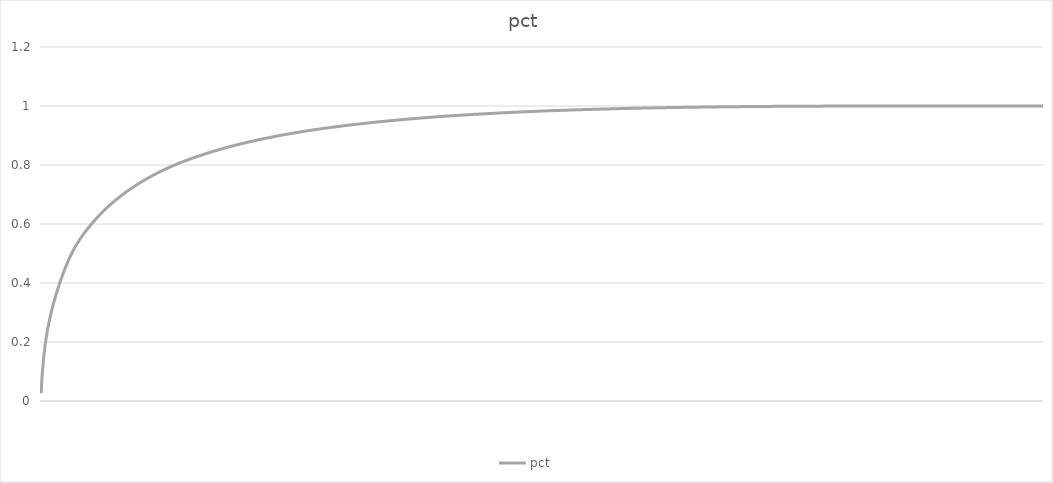
| Category | pct |
|---|---|
|   | 0.026 |
|   | 0.042 |
|   | 0.057 |
|   | 0.071 |
|   | 0.083 |
|   | 0.094 |
|   | 0.103 |
|   | 0.113 |
|   | 0.122 |
|   | 0.13 |
|   | 0.139 |
|   | 0.147 |
|   | 0.155 |
|   | 0.163 |
|   | 0.171 |
|   | 0.178 |
|   | 0.184 |
|   | 0.19 |
|   | 0.196 |
|   | 0.202 |
|   | 0.207 |
|   | 0.212 |
|   | 0.217 |
|   | 0.223 |
|   | 0.228 |
|   | 0.232 |
|   | 0.237 |
|   | 0.241 |
|   | 0.246 |
|   | 0.25 |
|   | 0.254 |
|   | 0.258 |
|   | 0.262 |
|   | 0.266 |
|   | 0.27 |
|   | 0.274 |
|   | 0.277 |
|   | 0.281 |
|   | 0.285 |
|   | 0.288 |
|   | 0.292 |
|   | 0.296 |
|   | 0.299 |
|   | 0.302 |
|   | 0.306 |
|   | 0.309 |
|   | 0.312 |
|   | 0.315 |
|   | 0.318 |
|   | 0.322 |
|   | 0.325 |
|   | 0.327 |
|   | 0.33 |
|   | 0.333 |
|   | 0.336 |
|   | 0.339 |
|   | 0.342 |
|   | 0.345 |
|   | 0.348 |
|   | 0.35 |
|   | 0.353 |
|   | 0.356 |
|   | 0.358 |
|   | 0.361 |
|   | 0.364 |
|   | 0.367 |
|   | 0.369 |
|   | 0.372 |
|   | 0.374 |
|   | 0.377 |
|   | 0.38 |
|   | 0.382 |
|   | 0.385 |
|   | 0.387 |
|   | 0.39 |
|   | 0.392 |
|   | 0.394 |
|   | 0.397 |
|   | 0.399 |
|   | 0.402 |
|   | 0.404 |
|   | 0.406 |
|   | 0.409 |
|   | 0.411 |
|   | 0.413 |
|   | 0.416 |
|   | 0.418 |
|   | 0.42 |
|   | 0.422 |
|   | 0.424 |
|   | 0.427 |
|   | 0.429 |
|   | 0.431 |
|   | 0.433 |
|   | 0.435 |
|   | 0.437 |
|   | 0.439 |
|   | 0.442 |
|   | 0.444 |
|   | 0.446 |
|   | 0.448 |
|   | 0.45 |
|   | 0.452 |
|   | 0.454 |
|   | 0.456 |
|   | 0.458 |
|   | 0.46 |
|   | 0.462 |
|   | 0.464 |
|   | 0.466 |
|   | 0.468 |
|   | 0.47 |
|   | 0.471 |
|   | 0.473 |
|   | 0.475 |
|   | 0.477 |
|   | 0.479 |
|   | 0.481 |
|   | 0.482 |
|   | 0.484 |
|   | 0.486 |
|   | 0.487 |
|   | 0.489 |
|   | 0.491 |
|   | 0.493 |
|   | 0.494 |
|   | 0.496 |
|   | 0.498 |
|   | 0.499 |
|   | 0.501 |
|   | 0.502 |
|   | 0.504 |
|   | 0.506 |
|   | 0.507 |
|   | 0.509 |
|   | 0.51 |
|   | 0.512 |
|   | 0.513 |
|   | 0.515 |
|   | 0.516 |
|   | 0.518 |
|   | 0.519 |
|   | 0.521 |
|   | 0.522 |
|   | 0.523 |
|   | 0.525 |
|   | 0.526 |
|   | 0.527 |
|   | 0.529 |
|   | 0.53 |
|   | 0.531 |
|   | 0.533 |
|   | 0.534 |
|   | 0.535 |
|   | 0.537 |
|   | 0.538 |
|   | 0.539 |
|   | 0.54 |
|   | 0.542 |
|   | 0.543 |
|   | 0.544 |
|   | 0.545 |
|   | 0.547 |
|   | 0.548 |
|   | 0.549 |
|   | 0.55 |
|   | 0.551 |
|   | 0.553 |
|   | 0.554 |
|   | 0.555 |
|   | 0.556 |
|   | 0.557 |
|   | 0.559 |
|   | 0.56 |
|   | 0.561 |
|   | 0.562 |
|   | 0.563 |
|   | 0.564 |
|   | 0.565 |
|   | 0.566 |
|   | 0.567 |
|   | 0.569 |
|   | 0.57 |
|   | 0.571 |
|   | 0.572 |
|   | 0.573 |
|   | 0.574 |
|   | 0.575 |
|   | 0.576 |
|   | 0.577 |
|   | 0.578 |
|   | 0.579 |
|   | 0.58 |
|   | 0.581 |
|   | 0.582 |
|   | 0.583 |
|   | 0.584 |
|   | 0.585 |
|   | 0.586 |
|   | 0.587 |
|   | 0.588 |
|   | 0.589 |
|   | 0.59 |
|   | 0.591 |
|   | 0.592 |
|   | 0.593 |
|   | 0.594 |
|   | 0.595 |
|   | 0.596 |
|   | 0.597 |
|   | 0.598 |
|   | 0.599 |
|   | 0.6 |
|   | 0.601 |
|   | 0.602 |
|   | 0.603 |
|   | 0.604 |
|   | 0.605 |
|   | 0.606 |
|   | 0.607 |
|   | 0.607 |
|   | 0.608 |
|   | 0.609 |
|   | 0.61 |
|   | 0.611 |
|   | 0.612 |
|   | 0.613 |
|   | 0.614 |
|   | 0.615 |
|   | 0.616 |
|   | 0.617 |
|   | 0.617 |
|   | 0.618 |
|   | 0.619 |
|   | 0.62 |
|   | 0.621 |
|   | 0.622 |
|   | 0.623 |
|   | 0.624 |
|   | 0.624 |
|   | 0.625 |
|   | 0.626 |
|   | 0.627 |
|   | 0.628 |
|   | 0.629 |
|   | 0.63 |
|   | 0.63 |
|   | 0.631 |
|   | 0.632 |
|   | 0.633 |
|   | 0.634 |
|   | 0.635 |
|   | 0.636 |
|   | 0.636 |
|   | 0.637 |
|   | 0.638 |
|   | 0.639 |
|   | 0.64 |
|   | 0.64 |
|   | 0.641 |
|   | 0.642 |
|   | 0.643 |
|   | 0.644 |
|   | 0.645 |
|   | 0.645 |
|   | 0.646 |
|   | 0.647 |
|   | 0.648 |
|   | 0.649 |
|   | 0.649 |
|   | 0.65 |
|   | 0.651 |
|   | 0.652 |
|   | 0.652 |
|   | 0.653 |
|   | 0.654 |
|   | 0.655 |
|   | 0.656 |
|   | 0.656 |
|   | 0.657 |
|   | 0.658 |
|   | 0.659 |
|   | 0.659 |
|   | 0.66 |
|   | 0.661 |
|   | 0.662 |
|   | 0.662 |
|   | 0.663 |
|   | 0.664 |
|   | 0.664 |
|   | 0.665 |
|   | 0.666 |
|   | 0.667 |
|   | 0.667 |
|   | 0.668 |
|   | 0.669 |
|   | 0.669 |
|   | 0.67 |
|   | 0.671 |
|   | 0.671 |
|   | 0.672 |
|   | 0.673 |
|   | 0.673 |
|   | 0.674 |
|   | 0.675 |
|   | 0.676 |
|   | 0.676 |
|   | 0.677 |
|   | 0.678 |
|   | 0.678 |
|   | 0.679 |
|   | 0.68 |
|   | 0.68 |
|   | 0.681 |
|   | 0.682 |
|   | 0.682 |
|   | 0.683 |
|   | 0.684 |
|   | 0.684 |
|   | 0.685 |
|   | 0.686 |
|   | 0.686 |
|   | 0.687 |
|   | 0.688 |
|   | 0.688 |
|   | 0.689 |
|   | 0.689 |
|   | 0.69 |
|   | 0.691 |
|   | 0.691 |
|   | 0.692 |
|   | 0.693 |
|   | 0.693 |
|   | 0.694 |
|   | 0.694 |
|   | 0.695 |
|   | 0.696 |
|   | 0.696 |
|   | 0.697 |
|   | 0.698 |
|   | 0.698 |
|   | 0.699 |
|   | 0.699 |
|   | 0.7 |
|   | 0.701 |
|   | 0.701 |
|   | 0.702 |
|   | 0.702 |
|   | 0.703 |
|   | 0.704 |
|   | 0.704 |
|   | 0.705 |
|   | 0.705 |
|   | 0.706 |
|   | 0.707 |
|   | 0.707 |
|   | 0.708 |
|   | 0.708 |
|   | 0.709 |
|   | 0.709 |
|   | 0.71 |
|   | 0.711 |
|   | 0.711 |
|   | 0.712 |
|   | 0.712 |
|   | 0.713 |
|   | 0.713 |
|   | 0.714 |
|   | 0.715 |
|   | 0.715 |
|   | 0.716 |
|   | 0.716 |
|   | 0.717 |
|   | 0.717 |
|   | 0.718 |
|   | 0.718 |
|   | 0.719 |
|   | 0.719 |
|   | 0.72 |
|   | 0.721 |
|   | 0.721 |
|   | 0.722 |
|   | 0.722 |
|   | 0.723 |
|   | 0.723 |
|   | 0.724 |
|   | 0.724 |
|   | 0.725 |
|   | 0.725 |
|   | 0.726 |
|   | 0.727 |
|   | 0.727 |
|   | 0.728 |
|   | 0.728 |
|   | 0.729 |
|   | 0.729 |
|   | 0.73 |
|   | 0.73 |
|   | 0.731 |
|   | 0.731 |
|   | 0.732 |
|   | 0.732 |
|   | 0.733 |
|   | 0.733 |
|   | 0.734 |
|   | 0.734 |
|   | 0.735 |
|   | 0.735 |
|   | 0.736 |
|   | 0.736 |
|   | 0.737 |
|   | 0.737 |
|   | 0.738 |
|   | 0.738 |
|   | 0.739 |
|   | 0.739 |
|   | 0.74 |
|   | 0.74 |
|   | 0.741 |
|   | 0.741 |
|   | 0.742 |
|   | 0.742 |
|   | 0.743 |
|   | 0.743 |
|   | 0.744 |
|   | 0.744 |
|   | 0.745 |
|   | 0.745 |
|   | 0.746 |
|   | 0.746 |
|   | 0.747 |
|   | 0.747 |
|   | 0.748 |
|   | 0.748 |
|   | 0.749 |
|   | 0.749 |
|   | 0.75 |
|   | 0.75 |
|   | 0.751 |
|   | 0.751 |
|   | 0.751 |
|   | 0.752 |
|   | 0.752 |
|   | 0.753 |
|   | 0.753 |
|   | 0.754 |
|   | 0.754 |
|   | 0.755 |
|   | 0.755 |
|   | 0.756 |
|   | 0.756 |
|   | 0.756 |
|   | 0.757 |
|   | 0.757 |
|   | 0.758 |
|   | 0.758 |
|   | 0.759 |
|   | 0.759 |
|   | 0.76 |
|   | 0.76 |
|   | 0.76 |
|   | 0.761 |
|   | 0.761 |
|   | 0.762 |
|   | 0.762 |
|   | 0.763 |
|   | 0.763 |
|   | 0.764 |
|   | 0.764 |
|   | 0.764 |
|   | 0.765 |
|   | 0.765 |
|   | 0.766 |
|   | 0.766 |
|   | 0.767 |
|   | 0.767 |
|   | 0.767 |
|   | 0.768 |
|   | 0.768 |
|   | 0.769 |
|   | 0.769 |
|   | 0.77 |
|   | 0.77 |
|   | 0.77 |
|   | 0.771 |
|   | 0.771 |
|   | 0.772 |
|   | 0.772 |
|   | 0.772 |
|   | 0.773 |
|   | 0.773 |
|   | 0.774 |
|   | 0.774 |
|   | 0.775 |
|   | 0.775 |
|   | 0.775 |
|   | 0.776 |
|   | 0.776 |
|   | 0.777 |
|   | 0.777 |
|   | 0.777 |
|   | 0.778 |
|   | 0.778 |
|   | 0.779 |
|   | 0.779 |
|   | 0.779 |
|   | 0.78 |
|   | 0.78 |
|   | 0.78 |
|   | 0.781 |
|   | 0.781 |
|   | 0.782 |
|   | 0.782 |
|   | 0.782 |
|   | 0.783 |
|   | 0.783 |
|   | 0.784 |
|   | 0.784 |
|   | 0.784 |
|   | 0.785 |
|   | 0.785 |
|   | 0.785 |
|   | 0.786 |
|   | 0.786 |
|   | 0.787 |
|   | 0.787 |
|   | 0.787 |
|   | 0.788 |
|   | 0.788 |
|   | 0.788 |
|   | 0.789 |
|   | 0.789 |
|   | 0.79 |
|   | 0.79 |
|   | 0.79 |
|   | 0.791 |
|   | 0.791 |
|   | 0.791 |
|   | 0.792 |
|   | 0.792 |
|   | 0.792 |
|   | 0.793 |
|   | 0.793 |
|   | 0.793 |
|   | 0.794 |
|   | 0.794 |
|   | 0.795 |
|   | 0.795 |
|   | 0.795 |
|   | 0.796 |
|   | 0.796 |
|   | 0.796 |
|   | 0.797 |
|   | 0.797 |
|   | 0.797 |
|   | 0.798 |
|   | 0.798 |
|   | 0.798 |
|   | 0.799 |
|   | 0.799 |
|   | 0.799 |
|   | 0.8 |
|   | 0.8 |
|   | 0.8 |
|   | 0.801 |
|   | 0.801 |
|   | 0.802 |
|   | 0.802 |
|   | 0.802 |
|   | 0.803 |
|   | 0.803 |
|   | 0.803 |
|   | 0.804 |
|   | 0.804 |
|   | 0.804 |
|   | 0.805 |
|   | 0.805 |
|   | 0.805 |
|   | 0.806 |
|   | 0.806 |
|   | 0.806 |
|   | 0.806 |
|   | 0.807 |
|   | 0.807 |
|   | 0.807 |
|   | 0.808 |
|   | 0.808 |
|   | 0.808 |
|   | 0.809 |
|   | 0.809 |
|   | 0.809 |
|   | 0.81 |
|   | 0.81 |
|   | 0.81 |
|   | 0.811 |
|   | 0.811 |
|   | 0.811 |
|   | 0.812 |
|   | 0.812 |
|   | 0.812 |
|   | 0.812 |
|   | 0.813 |
|   | 0.813 |
|   | 0.813 |
|   | 0.814 |
|   | 0.814 |
|   | 0.814 |
|   | 0.815 |
|   | 0.815 |
|   | 0.815 |
|   | 0.816 |
|   | 0.816 |
|   | 0.816 |
|   | 0.816 |
|   | 0.817 |
|   | 0.817 |
|   | 0.817 |
|   | 0.818 |
|   | 0.818 |
|   | 0.818 |
|   | 0.819 |
|   | 0.819 |
|   | 0.819 |
|   | 0.819 |
|   | 0.82 |
|   | 0.82 |
|   | 0.82 |
|   | 0.821 |
|   | 0.821 |
|   | 0.821 |
|   | 0.821 |
|   | 0.822 |
|   | 0.822 |
|   | 0.822 |
|   | 0.823 |
|   | 0.823 |
|   | 0.823 |
|   | 0.823 |
|   | 0.824 |
|   | 0.824 |
|   | 0.824 |
|   | 0.825 |
|   | 0.825 |
|   | 0.825 |
|   | 0.825 |
|   | 0.826 |
|   | 0.826 |
|   | 0.826 |
|   | 0.826 |
|   | 0.827 |
|   | 0.827 |
|   | 0.827 |
|   | 0.828 |
|   | 0.828 |
|   | 0.828 |
|   | 0.828 |
|   | 0.829 |
|   | 0.829 |
|   | 0.829 |
|   | 0.829 |
|   | 0.83 |
|   | 0.83 |
|   | 0.83 |
|   | 0.831 |
|   | 0.831 |
|   | 0.831 |
|   | 0.831 |
|   | 0.832 |
|   | 0.832 |
|   | 0.832 |
|   | 0.832 |
|   | 0.833 |
|   | 0.833 |
|   | 0.833 |
|   | 0.834 |
|   | 0.834 |
|   | 0.834 |
|   | 0.834 |
|   | 0.835 |
|   | 0.835 |
|   | 0.835 |
|   | 0.835 |
|   | 0.836 |
|   | 0.836 |
|   | 0.836 |
|   | 0.836 |
|   | 0.837 |
|   | 0.837 |
|   | 0.837 |
|   | 0.837 |
|   | 0.838 |
|   | 0.838 |
|   | 0.838 |
|   | 0.839 |
|   | 0.839 |
|   | 0.839 |
|   | 0.839 |
|   | 0.84 |
|   | 0.84 |
|   | 0.84 |
|   | 0.84 |
|   | 0.841 |
|   | 0.841 |
|   | 0.841 |
|   | 0.841 |
|   | 0.842 |
|   | 0.842 |
|   | 0.842 |
|   | 0.842 |
|   | 0.843 |
|   | 0.843 |
|   | 0.843 |
|   | 0.843 |
|   | 0.844 |
|   | 0.844 |
|   | 0.844 |
|   | 0.844 |
|   | 0.845 |
|   | 0.845 |
|   | 0.845 |
|   | 0.845 |
|   | 0.846 |
|   | 0.846 |
|   | 0.846 |
|   | 0.846 |
|   | 0.847 |
|   | 0.847 |
|   | 0.847 |
|   | 0.847 |
|   | 0.848 |
|   | 0.848 |
|   | 0.848 |
|   | 0.848 |
|   | 0.849 |
|   | 0.849 |
|   | 0.849 |
|   | 0.849 |
|   | 0.85 |
|   | 0.85 |
|   | 0.85 |
|   | 0.85 |
|   | 0.851 |
|   | 0.851 |
|   | 0.851 |
|   | 0.851 |
|   | 0.851 |
|   | 0.852 |
|   | 0.852 |
|   | 0.852 |
|   | 0.852 |
|   | 0.853 |
|   | 0.853 |
|   | 0.853 |
|   | 0.853 |
|   | 0.854 |
|   | 0.854 |
|   | 0.854 |
|   | 0.854 |
|   | 0.855 |
|   | 0.855 |
|   | 0.855 |
|   | 0.855 |
|   | 0.855 |
|   | 0.856 |
|   | 0.856 |
|   | 0.856 |
|   | 0.856 |
|   | 0.857 |
|   | 0.857 |
|   | 0.857 |
|   | 0.857 |
|   | 0.857 |
|   | 0.858 |
|   | 0.858 |
|   | 0.858 |
|   | 0.858 |
|   | 0.858 |
|   | 0.859 |
|   | 0.859 |
|   | 0.859 |
|   | 0.859 |
|   | 0.86 |
|   | 0.86 |
|   | 0.86 |
|   | 0.86 |
|   | 0.86 |
|   | 0.861 |
|   | 0.861 |
|   | 0.861 |
|   | 0.861 |
|   | 0.861 |
|   | 0.862 |
|   | 0.862 |
|   | 0.862 |
|   | 0.862 |
|   | 0.863 |
|   | 0.863 |
|   | 0.863 |
|   | 0.863 |
|   | 0.863 |
|   | 0.864 |
|   | 0.864 |
|   | 0.864 |
|   | 0.864 |
|   | 0.864 |
|   | 0.865 |
|   | 0.865 |
|   | 0.865 |
|   | 0.865 |
|   | 0.865 |
|   | 0.866 |
|   | 0.866 |
|   | 0.866 |
|   | 0.866 |
|   | 0.867 |
|   | 0.867 |
|   | 0.867 |
|   | 0.867 |
|   | 0.867 |
|   | 0.868 |
|   | 0.868 |
|   | 0.868 |
|   | 0.868 |
|   | 0.868 |
|   | 0.869 |
|   | 0.869 |
|   | 0.869 |
|   | 0.869 |
|   | 0.869 |
|   | 0.87 |
|   | 0.87 |
|   | 0.87 |
|   | 0.87 |
|   | 0.87 |
|   | 0.87 |
|   | 0.871 |
|   | 0.871 |
|   | 0.871 |
|   | 0.871 |
|   | 0.871 |
|   | 0.872 |
|   | 0.872 |
|   | 0.872 |
|   | 0.872 |
|   | 0.872 |
|   | 0.873 |
|   | 0.873 |
|   | 0.873 |
|   | 0.873 |
|   | 0.873 |
|   | 0.874 |
|   | 0.874 |
|   | 0.874 |
|   | 0.874 |
|   | 0.874 |
|   | 0.875 |
|   | 0.875 |
|   | 0.875 |
|   | 0.875 |
|   | 0.875 |
|   | 0.875 |
|   | 0.876 |
|   | 0.876 |
|   | 0.876 |
|   | 0.876 |
|   | 0.876 |
|   | 0.877 |
|   | 0.877 |
|   | 0.877 |
|   | 0.877 |
|   | 0.877 |
|   | 0.878 |
|   | 0.878 |
|   | 0.878 |
|   | 0.878 |
|   | 0.878 |
|   | 0.878 |
|   | 0.879 |
|   | 0.879 |
|   | 0.879 |
|   | 0.879 |
|   | 0.879 |
|   | 0.88 |
|   | 0.88 |
|   | 0.88 |
|   | 0.88 |
|   | 0.88 |
|   | 0.881 |
|   | 0.881 |
|   | 0.881 |
|   | 0.881 |
|   | 0.881 |
|   | 0.881 |
|   | 0.882 |
|   | 0.882 |
|   | 0.882 |
|   | 0.882 |
|   | 0.882 |
|   | 0.883 |
|   | 0.883 |
|   | 0.883 |
|   | 0.883 |
|   | 0.883 |
|   | 0.883 |
|   | 0.884 |
|   | 0.884 |
|   | 0.884 |
|   | 0.884 |
|   | 0.884 |
|   | 0.884 |
|   | 0.885 |
|   | 0.885 |
|   | 0.885 |
|   | 0.885 |
|   | 0.885 |
|   | 0.886 |
|   | 0.886 |
|   | 0.886 |
|   | 0.886 |
|   | 0.886 |
|   | 0.886 |
|   | 0.887 |
|   | 0.887 |
|   | 0.887 |
|   | 0.887 |
|   | 0.887 |
|   | 0.887 |
|   | 0.888 |
|   | 0.888 |
|   | 0.888 |
|   | 0.888 |
|   | 0.888 |
|   | 0.888 |
|   | 0.889 |
|   | 0.889 |
|   | 0.889 |
|   | 0.889 |
|   | 0.889 |
|   | 0.889 |
|   | 0.89 |
|   | 0.89 |
|   | 0.89 |
|   | 0.89 |
|   | 0.89 |
|   | 0.89 |
|   | 0.891 |
|   | 0.891 |
|   | 0.891 |
|   | 0.891 |
|   | 0.891 |
|   | 0.891 |
|   | 0.892 |
|   | 0.892 |
|   | 0.892 |
|   | 0.892 |
|   | 0.892 |
|   | 0.892 |
|   | 0.893 |
|   | 0.893 |
|   | 0.893 |
|   | 0.893 |
|   | 0.893 |
|   | 0.893 |
|   | 0.894 |
|   | 0.894 |
|   | 0.894 |
|   | 0.894 |
|   | 0.894 |
|   | 0.894 |
|   | 0.895 |
|   | 0.895 |
|   | 0.895 |
|   | 0.895 |
|   | 0.895 |
|   | 0.895 |
|   | 0.895 |
|   | 0.896 |
|   | 0.896 |
|   | 0.896 |
|   | 0.896 |
|   | 0.896 |
|   | 0.896 |
|   | 0.897 |
|   | 0.897 |
|   | 0.897 |
|   | 0.897 |
|   | 0.897 |
|   | 0.897 |
|   | 0.898 |
|   | 0.898 |
|   | 0.898 |
|   | 0.898 |
|   | 0.898 |
|   | 0.898 |
|   | 0.898 |
|   | 0.899 |
|   | 0.899 |
|   | 0.899 |
|   | 0.899 |
| 1000 | 0.899 |
|   | 0.899 |
|   | 0.9 |
|   | 0.9 |
|   | 0.9 |
|   | 0.9 |
|   | 0.9 |
|   | 0.9 |
|   | 0.9 |
|   | 0.901 |
|   | 0.901 |
|   | 0.901 |
|   | 0.901 |
|   | 0.901 |
|   | 0.901 |
|   | 0.901 |
|   | 0.902 |
|   | 0.902 |
|   | 0.902 |
|   | 0.902 |
|   | 0.902 |
|   | 0.902 |
|   | 0.903 |
|   | 0.903 |
|   | 0.903 |
|   | 0.903 |
|   | 0.903 |
|   | 0.903 |
|   | 0.903 |
|   | 0.904 |
|   | 0.904 |
|   | 0.904 |
|   | 0.904 |
|   | 0.904 |
|   | 0.904 |
|   | 0.904 |
|   | 0.905 |
|   | 0.905 |
|   | 0.905 |
|   | 0.905 |
|   | 0.905 |
|   | 0.905 |
|   | 0.905 |
|   | 0.906 |
|   | 0.906 |
|   | 0.906 |
|   | 0.906 |
|   | 0.906 |
|   | 0.906 |
|   | 0.906 |
|   | 0.907 |
|   | 0.907 |
|   | 0.907 |
|   | 0.907 |
|   | 0.907 |
|   | 0.907 |
|   | 0.907 |
|   | 0.908 |
|   | 0.908 |
|   | 0.908 |
|   | 0.908 |
|   | 0.908 |
|   | 0.908 |
|   | 0.908 |
|   | 0.909 |
|   | 0.909 |
|   | 0.909 |
|   | 0.909 |
|   | 0.909 |
|   | 0.909 |
|   | 0.909 |
|   | 0.909 |
|   | 0.91 |
|   | 0.91 |
|   | 0.91 |
|   | 0.91 |
|   | 0.91 |
|   | 0.91 |
|   | 0.91 |
|   | 0.911 |
|   | 0.911 |
|   | 0.911 |
|   | 0.911 |
|   | 0.911 |
|   | 0.911 |
|   | 0.911 |
|   | 0.911 |
|   | 0.912 |
|   | 0.912 |
|   | 0.912 |
|   | 0.912 |
|   | 0.912 |
|   | 0.912 |
|   | 0.912 |
|   | 0.913 |
|   | 0.913 |
|   | 0.913 |
|   | 0.913 |
|   | 0.913 |
|   | 0.913 |
|   | 0.913 |
|   | 0.913 |
|   | 0.914 |
|   | 0.914 |
|   | 0.914 |
|   | 0.914 |
|   | 0.914 |
|   | 0.914 |
|   | 0.914 |
|   | 0.914 |
|   | 0.915 |
|   | 0.915 |
|   | 0.915 |
|   | 0.915 |
|   | 0.915 |
|   | 0.915 |
|   | 0.915 |
|   | 0.915 |
|   | 0.916 |
|   | 0.916 |
|   | 0.916 |
|   | 0.916 |
|   | 0.916 |
|   | 0.916 |
|   | 0.916 |
|   | 0.916 |
|   | 0.917 |
|   | 0.917 |
|   | 0.917 |
|   | 0.917 |
|   | 0.917 |
|   | 0.917 |
|   | 0.917 |
|   | 0.917 |
|   | 0.918 |
|   | 0.918 |
|   | 0.918 |
|   | 0.918 |
|   | 0.918 |
|   | 0.918 |
|   | 0.918 |
|   | 0.918 |
|   | 0.919 |
|   | 0.919 |
|   | 0.919 |
|   | 0.919 |
|   | 0.919 |
|   | 0.919 |
|   | 0.919 |
|   | 0.919 |
|   | 0.92 |
|   | 0.92 |
|   | 0.92 |
|   | 0.92 |
|   | 0.92 |
|   | 0.92 |
|   | 0.92 |
|   | 0.92 |
|   | 0.92 |
|   | 0.921 |
|   | 0.921 |
|   | 0.921 |
|   | 0.921 |
|   | 0.921 |
|   | 0.921 |
|   | 0.921 |
|   | 0.921 |
|   | 0.921 |
|   | 0.922 |
|   | 0.922 |
|   | 0.922 |
|   | 0.922 |
|   | 0.922 |
|   | 0.922 |
|   | 0.922 |
|   | 0.922 |
|   | 0.923 |
|   | 0.923 |
|   | 0.923 |
|   | 0.923 |
|   | 0.923 |
|   | 0.923 |
|   | 0.923 |
|   | 0.923 |
|   | 0.923 |
|   | 0.924 |
|   | 0.924 |
|   | 0.924 |
|   | 0.924 |
|   | 0.924 |
|   | 0.924 |
|   | 0.924 |
|   | 0.924 |
|   | 0.924 |
|   | 0.925 |
|   | 0.925 |
|   | 0.925 |
|   | 0.925 |
|   | 0.925 |
|   | 0.925 |
|   | 0.925 |
|   | 0.925 |
|   | 0.925 |
|   | 0.926 |
|   | 0.926 |
|   | 0.926 |
|   | 0.926 |
|   | 0.926 |
|   | 0.926 |
|   | 0.926 |
|   | 0.926 |
|   | 0.926 |
|   | 0.927 |
|   | 0.927 |
|   | 0.927 |
|   | 0.927 |
|   | 0.927 |
|   | 0.927 |
|   | 0.927 |
|   | 0.927 |
|   | 0.927 |
|   | 0.928 |
|   | 0.928 |
|   | 0.928 |
|   | 0.928 |
|   | 0.928 |
|   | 0.928 |
|   | 0.928 |
|   | 0.928 |
|   | 0.928 |
|   | 0.928 |
|   | 0.929 |
|   | 0.929 |
|   | 0.929 |
|   | 0.929 |
|   | 0.929 |
|   | 0.929 |
|   | 0.929 |
|   | 0.929 |
|   | 0.929 |
|   | 0.93 |
|   | 0.93 |
|   | 0.93 |
|   | 0.93 |
|   | 0.93 |
|   | 0.93 |
|   | 0.93 |
|   | 0.93 |
|   | 0.93 |
|   | 0.93 |
|   | 0.931 |
|   | 0.931 |
|   | 0.931 |
|   | 0.931 |
|   | 0.931 |
|   | 0.931 |
|   | 0.931 |
|   | 0.931 |
|   | 0.931 |
|   | 0.931 |
|   | 0.932 |
|   | 0.932 |
|   | 0.932 |
|   | 0.932 |
|   | 0.932 |
|   | 0.932 |
|   | 0.932 |
|   | 0.932 |
|   | 0.932 |
|   | 0.933 |
|   | 0.933 |
|   | 0.933 |
|   | 0.933 |
|   | 0.933 |
|   | 0.933 |
|   | 0.933 |
|   | 0.933 |
|   | 0.933 |
|   | 0.933 |
|   | 0.934 |
|   | 0.934 |
|   | 0.934 |
|   | 0.934 |
|   | 0.934 |
|   | 0.934 |
|   | 0.934 |
|   | 0.934 |
|   | 0.934 |
|   | 0.934 |
|   | 0.935 |
|   | 0.935 |
|   | 0.935 |
|   | 0.935 |
|   | 0.935 |
|   | 0.935 |
|   | 0.935 |
|   | 0.935 |
|   | 0.935 |
|   | 0.935 |
|   | 0.936 |
|   | 0.936 |
|   | 0.936 |
|   | 0.936 |
|   | 0.936 |
|   | 0.936 |
|   | 0.936 |
|   | 0.936 |
|   | 0.936 |
|   | 0.936 |
|   | 0.936 |
|   | 0.937 |
|   | 0.937 |
|   | 0.937 |
|   | 0.937 |
|   | 0.937 |
|   | 0.937 |
|   | 0.937 |
|   | 0.937 |
|   | 0.937 |
|   | 0.937 |
|   | 0.937 |
|   | 0.938 |
|   | 0.938 |
|   | 0.938 |
|   | 0.938 |
|   | 0.938 |
|   | 0.938 |
|   | 0.938 |
|   | 0.938 |
|   | 0.938 |
|   | 0.938 |
|   | 0.939 |
|   | 0.939 |
|   | 0.939 |
|   | 0.939 |
|   | 0.939 |
|   | 0.939 |
|   | 0.939 |
|   | 0.939 |
|   | 0.939 |
|   | 0.939 |
|   | 0.939 |
|   | 0.94 |
|   | 0.94 |
|   | 0.94 |
|   | 0.94 |
|   | 0.94 |
|   | 0.94 |
|   | 0.94 |
|   | 0.94 |
|   | 0.94 |
|   | 0.94 |
|   | 0.94 |
|   | 0.941 |
|   | 0.941 |
|   | 0.941 |
|   | 0.941 |
|   | 0.941 |
|   | 0.941 |
|   | 0.941 |
|   | 0.941 |
|   | 0.941 |
|   | 0.941 |
|   | 0.941 |
|   | 0.941 |
|   | 0.942 |
|   | 0.942 |
|   | 0.942 |
|   | 0.942 |
|   | 0.942 |
|   | 0.942 |
|   | 0.942 |
|   | 0.942 |
|   | 0.942 |
|   | 0.942 |
|   | 0.942 |
|   | 0.943 |
|   | 0.943 |
|   | 0.943 |
|   | 0.943 |
|   | 0.943 |
|   | 0.943 |
|   | 0.943 |
|   | 0.943 |
|   | 0.943 |
|   | 0.943 |
|   | 0.943 |
|   | 0.943 |
|   | 0.944 |
|   | 0.944 |
|   | 0.944 |
|   | 0.944 |
|   | 0.944 |
|   | 0.944 |
|   | 0.944 |
|   | 0.944 |
|   | 0.944 |
|   | 0.944 |
|   | 0.944 |
|   | 0.945 |
|   | 0.945 |
|   | 0.945 |
|   | 0.945 |
|   | 0.945 |
|   | 0.945 |
|   | 0.945 |
|   | 0.945 |
|   | 0.945 |
|   | 0.945 |
|   | 0.945 |
|   | 0.945 |
|   | 0.946 |
|   | 0.946 |
|   | 0.946 |
|   | 0.946 |
|   | 0.946 |
|   | 0.946 |
|   | 0.946 |
|   | 0.946 |
|   | 0.946 |
|   | 0.946 |
|   | 0.946 |
|   | 0.946 |
|   | 0.946 |
|   | 0.947 |
|   | 0.947 |
|   | 0.947 |
|   | 0.947 |
|   | 0.947 |
|   | 0.947 |
|   | 0.947 |
|   | 0.947 |
|   | 0.947 |
|   | 0.947 |
|   | 0.947 |
|   | 0.947 |
|   | 0.948 |
|   | 0.948 |
|   | 0.948 |
|   | 0.948 |
|   | 0.948 |
|   | 0.948 |
|   | 0.948 |
|   | 0.948 |
|   | 0.948 |
|   | 0.948 |
|   | 0.948 |
|   | 0.948 |
|   | 0.948 |
|   | 0.949 |
|   | 0.949 |
|   | 0.949 |
|   | 0.949 |
|   | 0.949 |
|   | 0.949 |
|   | 0.949 |
|   | 0.949 |
|   | 0.949 |
|   | 0.949 |
|   | 0.949 |
|   | 0.949 |
|   | 0.95 |
|   | 0.95 |
|   | 0.95 |
|   | 0.95 |
|   | 0.95 |
|   | 0.95 |
|   | 0.95 |
|   | 0.95 |
|   | 0.95 |
|   | 0.95 |
|   | 0.95 |
|   | 0.95 |
|   | 0.95 |
|   | 0.95 |
|   | 0.951 |
|   | 0.951 |
|   | 0.951 |
|   | 0.951 |
|   | 0.951 |
|   | 0.951 |
|   | 0.951 |
|   | 0.951 |
|   | 0.951 |
|   | 0.951 |
|   | 0.951 |
|   | 0.951 |
|   | 0.951 |
|   | 0.952 |
|   | 0.952 |
|   | 0.952 |
|   | 0.952 |
|   | 0.952 |
|   | 0.952 |
|   | 0.952 |
|   | 0.952 |
|   | 0.952 |
|   | 0.952 |
|   | 0.952 |
|   | 0.952 |
|   | 0.952 |
|   | 0.952 |
|   | 0.953 |
|   | 0.953 |
|   | 0.953 |
|   | 0.953 |
|   | 0.953 |
|   | 0.953 |
|   | 0.953 |
|   | 0.953 |
|   | 0.953 |
|   | 0.953 |
|   | 0.953 |
|   | 0.953 |
|   | 0.953 |
|   | 0.954 |
|   | 0.954 |
|   | 0.954 |
|   | 0.954 |
|   | 0.954 |
|   | 0.954 |
|   | 0.954 |
|   | 0.954 |
|   | 0.954 |
|   | 0.954 |
|   | 0.954 |
|   | 0.954 |
|   | 0.954 |
|   | 0.954 |
|   | 0.955 |
|   | 0.955 |
|   | 0.955 |
|   | 0.955 |
|   | 0.955 |
|   | 0.955 |
|   | 0.955 |
|   | 0.955 |
|   | 0.955 |
|   | 0.955 |
|   | 0.955 |
|   | 0.955 |
|   | 0.955 |
|   | 0.955 |
|   | 0.955 |
|   | 0.956 |
|   | 0.956 |
|   | 0.956 |
|   | 0.956 |
|   | 0.956 |
|   | 0.956 |
|   | 0.956 |
|   | 0.956 |
|   | 0.956 |
|   | 0.956 |
|   | 0.956 |
|   | 0.956 |
|   | 0.956 |
|   | 0.956 |
|   | 0.957 |
|   | 0.957 |
|   | 0.957 |
|   | 0.957 |
|   | 0.957 |
|   | 0.957 |
|   | 0.957 |
|   | 0.957 |
|   | 0.957 |
|   | 0.957 |
|   | 0.957 |
|   | 0.957 |
|   | 0.957 |
|   | 0.957 |
|   | 0.957 |
|   | 0.958 |
|   | 0.958 |
|   | 0.958 |
|   | 0.958 |
|   | 0.958 |
|   | 0.958 |
|   | 0.958 |
|   | 0.958 |
|   | 0.958 |
|   | 0.958 |
|   | 0.958 |
|   | 0.958 |
|   | 0.958 |
|   | 0.958 |
|   | 0.958 |
|   | 0.959 |
|   | 0.959 |
|   | 0.959 |
|   | 0.959 |
|   | 0.959 |
|   | 0.959 |
|   | 0.959 |
|   | 0.959 |
|   | 0.959 |
|   | 0.959 |
|   | 0.959 |
|   | 0.959 |
|   | 0.959 |
|   | 0.959 |
|   | 0.959 |
|   | 0.96 |
|   | 0.96 |
|   | 0.96 |
|   | 0.96 |
|   | 0.96 |
|   | 0.96 |
|   | 0.96 |
|   | 0.96 |
|   | 0.96 |
|   | 0.96 |
|   | 0.96 |
|   | 0.96 |
|   | 0.96 |
|   | 0.96 |
|   | 0.96 |
|   | 0.961 |
|   | 0.961 |
|   | 0.961 |
|   | 0.961 |
|   | 0.961 |
|   | 0.961 |
|   | 0.961 |
|   | 0.961 |
|   | 0.961 |
|   | 0.961 |
|   | 0.961 |
|   | 0.961 |
|   | 0.961 |
|   | 0.961 |
|   | 0.961 |
|   | 0.961 |
|   | 0.962 |
|   | 0.962 |
|   | 0.962 |
|   | 0.962 |
|   | 0.962 |
|   | 0.962 |
|   | 0.962 |
|   | 0.962 |
|   | 0.962 |
|   | 0.962 |
|   | 0.962 |
|   | 0.962 |
|   | 0.962 |
|   | 0.962 |
|   | 0.962 |
|   | 0.962 |
|   | 0.963 |
|   | 0.963 |
|   | 0.963 |
|   | 0.963 |
|   | 0.963 |
|   | 0.963 |
|   | 0.963 |
|   | 0.963 |
|   | 0.963 |
|   | 0.963 |
|   | 0.963 |
|   | 0.963 |
|   | 0.963 |
|   | 0.963 |
|   | 0.963 |
|   | 0.963 |
|   | 0.963 |
|   | 0.964 |
|   | 0.964 |
|   | 0.964 |
|   | 0.964 |
|   | 0.964 |
|   | 0.964 |
|   | 0.964 |
|   | 0.964 |
|   | 0.964 |
|   | 0.964 |
|   | 0.964 |
|   | 0.964 |
|   | 0.964 |
|   | 0.964 |
|   | 0.964 |
|   | 0.964 |
|   | 0.964 |
|   | 0.965 |
|   | 0.965 |
|   | 0.965 |
|   | 0.965 |
|   | 0.965 |
|   | 0.965 |
|   | 0.965 |
|   | 0.965 |
|   | 0.965 |
|   | 0.965 |
|   | 0.965 |
|   | 0.965 |
|   | 0.965 |
|   | 0.965 |
|   | 0.965 |
|   | 0.965 |
|   | 0.965 |
|   | 0.965 |
|   | 0.966 |
|   | 0.966 |
|   | 0.966 |
|   | 0.966 |
|   | 0.966 |
|   | 0.966 |
|   | 0.966 |
|   | 0.966 |
|   | 0.966 |
|   | 0.966 |
|   | 0.966 |
|   | 0.966 |
|   | 0.966 |
|   | 0.966 |
|   | 0.966 |
|   | 0.966 |
|   | 0.966 |
|   | 0.966 |
|   | 0.967 |
|   | 0.967 |
|   | 0.967 |
|   | 0.967 |
|   | 0.967 |
|   | 0.967 |
|   | 0.967 |
|   | 0.967 |
|   | 0.967 |
|   | 0.967 |
|   | 0.967 |
|   | 0.967 |
|   | 0.967 |
|   | 0.967 |
|   | 0.967 |
|   | 0.967 |
|   | 0.967 |
|   | 0.967 |
|   | 0.967 |
|   | 0.968 |
|   | 0.968 |
|   | 0.968 |
|   | 0.968 |
|   | 0.968 |
|   | 0.968 |
|   | 0.968 |
|   | 0.968 |
|   | 0.968 |
|   | 0.968 |
|   | 0.968 |
|   | 0.968 |
|   | 0.968 |
|   | 0.968 |
|   | 0.968 |
|   | 0.968 |
|   | 0.968 |
|   | 0.968 |
|   | 0.968 |
|   | 0.968 |
|   | 0.969 |
|   | 0.969 |
|   | 0.969 |
|   | 0.969 |
|   | 0.969 |
|   | 0.969 |
|   | 0.969 |
|   | 0.969 |
|   | 0.969 |
|   | 0.969 |
|   | 0.969 |
|   | 0.969 |
|   | 0.969 |
|   | 0.969 |
|   | 0.969 |
|   | 0.969 |
|   | 0.969 |
|   | 0.969 |
|   | 0.969 |
|   | 0.97 |
|   | 0.97 |
|   | 0.97 |
|   | 0.97 |
|   | 0.97 |
|   | 0.97 |
|   | 0.97 |
|   | 0.97 |
|   | 0.97 |
|   | 0.97 |
|   | 0.97 |
|   | 0.97 |
|   | 0.97 |
|   | 0.97 |
|   | 0.97 |
|   | 0.97 |
|   | 0.97 |
|   | 0.97 |
|   | 0.97 |
|   | 0.97 |
|   | 0.971 |
|   | 0.971 |
|   | 0.971 |
|   | 0.971 |
|   | 0.971 |
|   | 0.971 |
|   | 0.971 |
|   | 0.971 |
|   | 0.971 |
|   | 0.971 |
|   | 0.971 |
|   | 0.971 |
|   | 0.971 |
|   | 0.971 |
|   | 0.971 |
|   | 0.971 |
|   | 0.971 |
|   | 0.971 |
|   | 0.971 |
|   | 0.971 |
|   | 0.971 |
|   | 0.972 |
|   | 0.972 |
|   | 0.972 |
|   | 0.972 |
|   | 0.972 |
|   | 0.972 |
|   | 0.972 |
|   | 0.972 |
|   | 0.972 |
|   | 0.972 |
|   | 0.972 |
|   | 0.972 |
|   | 0.972 |
|   | 0.972 |
|   | 0.972 |
|   | 0.972 |
|   | 0.972 |
|   | 0.972 |
|   | 0.972 |
|   | 0.972 |
|   | 0.972 |
|   | 0.972 |
|   | 0.973 |
|   | 0.973 |
|   | 0.973 |
|   | 0.973 |
|   | 0.973 |
|   | 0.973 |
|   | 0.973 |
|   | 0.973 |
|   | 0.973 |
|   | 0.973 |
|   | 0.973 |
|   | 0.973 |
|   | 0.973 |
|   | 0.973 |
|   | 0.973 |
|   | 0.973 |
|   | 0.973 |
|   | 0.973 |
|   | 0.973 |
|   | 0.973 |
|   | 0.973 |
|   | 0.973 |
|   | 0.974 |
|   | 0.974 |
|   | 0.974 |
|   | 0.974 |
|   | 0.974 |
|   | 0.974 |
|   | 0.974 |
|   | 0.974 |
|   | 0.974 |
|   | 0.974 |
|   | 0.974 |
|   | 0.974 |
|   | 0.974 |
|   | 0.974 |
|   | 0.974 |
|   | 0.974 |
|   | 0.974 |
|   | 0.974 |
|   | 0.974 |
|   | 0.974 |
|   | 0.974 |
|   | 0.974 |
|   | 0.974 |
|   | 0.975 |
|   | 0.975 |
|   | 0.975 |
|   | 0.975 |
|   | 0.975 |
|   | 0.975 |
|   | 0.975 |
|   | 0.975 |
|   | 0.975 |
|   | 0.975 |
|   | 0.975 |
|   | 0.975 |
|   | 0.975 |
|   | 0.975 |
|   | 0.975 |
|   | 0.975 |
|   | 0.975 |
|   | 0.975 |
|   | 0.975 |
|   | 0.975 |
|   | 0.975 |
|   | 0.975 |
|   | 0.975 |
|   | 0.976 |
|   | 0.976 |
|   | 0.976 |
|   | 0.976 |
|   | 0.976 |
|   | 0.976 |
|   | 0.976 |
|   | 0.976 |
|   | 0.976 |
|   | 0.976 |
|   | 0.976 |
|   | 0.976 |
|   | 0.976 |
|   | 0.976 |
|   | 0.976 |
|   | 0.976 |
|   | 0.976 |
|   | 0.976 |
|   | 0.976 |
|   | 0.976 |
|   | 0.976 |
|   | 0.976 |
|   | 0.976 |
|   | 0.976 |
|   | 0.976 |
|   | 0.977 |
|   | 0.977 |
|   | 0.977 |
|   | 0.977 |
|   | 0.977 |
|   | 0.977 |
|   | 0.977 |
|   | 0.977 |
|   | 0.977 |
|   | 0.977 |
|   | 0.977 |
|   | 0.977 |
|   | 0.977 |
|   | 0.977 |
|   | 0.977 |
|   | 0.977 |
|   | 0.977 |
|   | 0.977 |
|   | 0.977 |
|   | 0.977 |
|   | 0.977 |
|   | 0.977 |
|   | 0.977 |
|   | 0.977 |
|   | 0.978 |
|   | 0.978 |
|   | 0.978 |
|   | 0.978 |
|   | 0.978 |
|   | 0.978 |
|   | 0.978 |
|   | 0.978 |
|   | 0.978 |
|   | 0.978 |
|   | 0.978 |
|   | 0.978 |
|   | 0.978 |
|   | 0.978 |
|   | 0.978 |
|   | 0.978 |
|   | 0.978 |
|   | 0.978 |
|   | 0.978 |
|   | 0.978 |
|   | 0.978 |
|   | 0.978 |
|   | 0.978 |
|   | 0.978 |
|   | 0.978 |
|   | 0.978 |
|   | 0.979 |
|   | 0.979 |
|   | 0.979 |
|   | 0.979 |
|   | 0.979 |
|   | 0.979 |
|   | 0.979 |
|   | 0.979 |
|   | 0.979 |
|   | 0.979 |
|   | 0.979 |
|   | 0.979 |
|   | 0.979 |
|   | 0.979 |
|   | 0.979 |
|   | 0.979 |
| 2000 | 0.979 |
|   | 0.979 |
|   | 0.979 |
|   | 0.979 |
|   | 0.979 |
|   | 0.979 |
|   | 0.979 |
|   | 0.979 |
|   | 0.979 |
|   | 0.979 |
|   | 0.979 |
|   | 0.98 |
|   | 0.98 |
|   | 0.98 |
|   | 0.98 |
|   | 0.98 |
|   | 0.98 |
|   | 0.98 |
|   | 0.98 |
|   | 0.98 |
|   | 0.98 |
|   | 0.98 |
|   | 0.98 |
|   | 0.98 |
|   | 0.98 |
|   | 0.98 |
|   | 0.98 |
|   | 0.98 |
|   | 0.98 |
|   | 0.98 |
|   | 0.98 |
|   | 0.98 |
|   | 0.98 |
|   | 0.98 |
|   | 0.98 |
|   | 0.98 |
|   | 0.98 |
|   | 0.98 |
|   | 0.981 |
|   | 0.981 |
|   | 0.981 |
|   | 0.981 |
|   | 0.981 |
|   | 0.981 |
|   | 0.981 |
|   | 0.981 |
|   | 0.981 |
|   | 0.981 |
|   | 0.981 |
|   | 0.981 |
|   | 0.981 |
|   | 0.981 |
|   | 0.981 |
|   | 0.981 |
|   | 0.981 |
|   | 0.981 |
|   | 0.981 |
|   | 0.981 |
|   | 0.981 |
|   | 0.981 |
|   | 0.981 |
|   | 0.981 |
|   | 0.981 |
|   | 0.981 |
|   | 0.981 |
|   | 0.981 |
|   | 0.981 |
|   | 0.982 |
|   | 0.982 |
|   | 0.982 |
|   | 0.982 |
|   | 0.982 |
|   | 0.982 |
|   | 0.982 |
|   | 0.982 |
|   | 0.982 |
|   | 0.982 |
|   | 0.982 |
|   | 0.982 |
|   | 0.982 |
|   | 0.982 |
|   | 0.982 |
|   | 0.982 |
|   | 0.982 |
|   | 0.982 |
|   | 0.982 |
|   | 0.982 |
|   | 0.982 |
|   | 0.982 |
|   | 0.982 |
|   | 0.982 |
|   | 0.982 |
|   | 0.982 |
|   | 0.982 |
|   | 0.982 |
|   | 0.982 |
|   | 0.982 |
|   | 0.983 |
|   | 0.983 |
|   | 0.983 |
|   | 0.983 |
|   | 0.983 |
|   | 0.983 |
|   | 0.983 |
|   | 0.983 |
|   | 0.983 |
|   | 0.983 |
|   | 0.983 |
|   | 0.983 |
|   | 0.983 |
|   | 0.983 |
|   | 0.983 |
|   | 0.983 |
|   | 0.983 |
|   | 0.983 |
|   | 0.983 |
|   | 0.983 |
|   | 0.983 |
|   | 0.983 |
|   | 0.983 |
|   | 0.983 |
|   | 0.983 |
|   | 0.983 |
|   | 0.983 |
|   | 0.983 |
|   | 0.983 |
|   | 0.983 |
|   | 0.983 |
|   | 0.984 |
|   | 0.984 |
|   | 0.984 |
|   | 0.984 |
|   | 0.984 |
|   | 0.984 |
|   | 0.984 |
|   | 0.984 |
|   | 0.984 |
|   | 0.984 |
|   | 0.984 |
|   | 0.984 |
|   | 0.984 |
|   | 0.984 |
|   | 0.984 |
|   | 0.984 |
|   | 0.984 |
|   | 0.984 |
|   | 0.984 |
|   | 0.984 |
|   | 0.984 |
|   | 0.984 |
|   | 0.984 |
|   | 0.984 |
|   | 0.984 |
|   | 0.984 |
|   | 0.984 |
|   | 0.984 |
|   | 0.984 |
|   | 0.984 |
|   | 0.984 |
|   | 0.984 |
|   | 0.984 |
|   | 0.985 |
|   | 0.985 |
|   | 0.985 |
|   | 0.985 |
|   | 0.985 |
|   | 0.985 |
|   | 0.985 |
|   | 0.985 |
|   | 0.985 |
|   | 0.985 |
|   | 0.985 |
|   | 0.985 |
|   | 0.985 |
|   | 0.985 |
|   | 0.985 |
|   | 0.985 |
|   | 0.985 |
|   | 0.985 |
|   | 0.985 |
|   | 0.985 |
|   | 0.985 |
|   | 0.985 |
|   | 0.985 |
|   | 0.985 |
|   | 0.985 |
|   | 0.985 |
|   | 0.985 |
|   | 0.985 |
|   | 0.985 |
|   | 0.985 |
|   | 0.985 |
|   | 0.985 |
|   | 0.985 |
|   | 0.985 |
|   | 0.985 |
|   | 0.986 |
|   | 0.986 |
|   | 0.986 |
|   | 0.986 |
|   | 0.986 |
|   | 0.986 |
|   | 0.986 |
|   | 0.986 |
|   | 0.986 |
|   | 0.986 |
|   | 0.986 |
|   | 0.986 |
|   | 0.986 |
|   | 0.986 |
|   | 0.986 |
|   | 0.986 |
|   | 0.986 |
|   | 0.986 |
|   | 0.986 |
|   | 0.986 |
|   | 0.986 |
|   | 0.986 |
|   | 0.986 |
|   | 0.986 |
|   | 0.986 |
|   | 0.986 |
|   | 0.986 |
|   | 0.986 |
|   | 0.986 |
|   | 0.986 |
|   | 0.986 |
|   | 0.986 |
|   | 0.986 |
|   | 0.986 |
|   | 0.986 |
|   | 0.986 |
|   | 0.986 |
|   | 0.987 |
|   | 0.987 |
|   | 0.987 |
|   | 0.987 |
|   | 0.987 |
|   | 0.987 |
|   | 0.987 |
|   | 0.987 |
|   | 0.987 |
|   | 0.987 |
|   | 0.987 |
|   | 0.987 |
|   | 0.987 |
|   | 0.987 |
|   | 0.987 |
|   | 0.987 |
|   | 0.987 |
|   | 0.987 |
|   | 0.987 |
|   | 0.987 |
|   | 0.987 |
|   | 0.987 |
|   | 0.987 |
|   | 0.987 |
|   | 0.987 |
|   | 0.987 |
|   | 0.987 |
|   | 0.987 |
|   | 0.987 |
|   | 0.987 |
|   | 0.987 |
|   | 0.987 |
|   | 0.987 |
|   | 0.987 |
|   | 0.987 |
|   | 0.987 |
|   | 0.987 |
|   | 0.987 |
|   | 0.987 |
|   | 0.988 |
|   | 0.988 |
|   | 0.988 |
|   | 0.988 |
|   | 0.988 |
|   | 0.988 |
|   | 0.988 |
|   | 0.988 |
|   | 0.988 |
|   | 0.988 |
|   | 0.988 |
|   | 0.988 |
|   | 0.988 |
|   | 0.988 |
|   | 0.988 |
|   | 0.988 |
|   | 0.988 |
|   | 0.988 |
|   | 0.988 |
|   | 0.988 |
|   | 0.988 |
|   | 0.988 |
|   | 0.988 |
|   | 0.988 |
|   | 0.988 |
|   | 0.988 |
|   | 0.988 |
|   | 0.988 |
|   | 0.988 |
|   | 0.988 |
|   | 0.988 |
|   | 0.988 |
|   | 0.988 |
|   | 0.988 |
|   | 0.988 |
|   | 0.988 |
|   | 0.988 |
|   | 0.988 |
|   | 0.988 |
|   | 0.988 |
|   | 0.988 |
|   | 0.989 |
|   | 0.989 |
|   | 0.989 |
|   | 0.989 |
|   | 0.989 |
|   | 0.989 |
|   | 0.989 |
|   | 0.989 |
|   | 0.989 |
|   | 0.989 |
|   | 0.989 |
|   | 0.989 |
|   | 0.989 |
|   | 0.989 |
|   | 0.989 |
|   | 0.989 |
|   | 0.989 |
|   | 0.989 |
|   | 0.989 |
|   | 0.989 |
|   | 0.989 |
|   | 0.989 |
|   | 0.989 |
|   | 0.989 |
|   | 0.989 |
|   | 0.989 |
|   | 0.989 |
|   | 0.989 |
|   | 0.989 |
|   | 0.989 |
|   | 0.989 |
|   | 0.989 |
|   | 0.989 |
|   | 0.989 |
|   | 0.989 |
|   | 0.989 |
|   | 0.989 |
|   | 0.989 |
|   | 0.989 |
|   | 0.989 |
|   | 0.989 |
|   | 0.989 |
|   | 0.989 |
|   | 0.989 |
|   | 0.99 |
|   | 0.99 |
|   | 0.99 |
|   | 0.99 |
|   | 0.99 |
|   | 0.99 |
|   | 0.99 |
|   | 0.99 |
|   | 0.99 |
|   | 0.99 |
|   | 0.99 |
|   | 0.99 |
|   | 0.99 |
|   | 0.99 |
|   | 0.99 |
|   | 0.99 |
|   | 0.99 |
|   | 0.99 |
|   | 0.99 |
|   | 0.99 |
|   | 0.99 |
|   | 0.99 |
|   | 0.99 |
|   | 0.99 |
|   | 0.99 |
|   | 0.99 |
|   | 0.99 |
|   | 0.99 |
|   | 0.99 |
|   | 0.99 |
|   | 0.99 |
|   | 0.99 |
|   | 0.99 |
|   | 0.99 |
|   | 0.99 |
|   | 0.99 |
|   | 0.99 |
|   | 0.99 |
|   | 0.99 |
|   | 0.99 |
|   | 0.99 |
|   | 0.99 |
|   | 0.99 |
|   | 0.99 |
|   | 0.99 |
|   | 0.99 |
|   | 0.99 |
|   | 0.991 |
|   | 0.991 |
|   | 0.991 |
|   | 0.991 |
|   | 0.991 |
|   | 0.991 |
|   | 0.991 |
|   | 0.991 |
|   | 0.991 |
|   | 0.991 |
|   | 0.991 |
|   | 0.991 |
|   | 0.991 |
|   | 0.991 |
|   | 0.991 |
|   | 0.991 |
|   | 0.991 |
|   | 0.991 |
|   | 0.991 |
|   | 0.991 |
|   | 0.991 |
|   | 0.991 |
|   | 0.991 |
|   | 0.991 |
|   | 0.991 |
|   | 0.991 |
|   | 0.991 |
|   | 0.991 |
|   | 0.991 |
|   | 0.991 |
|   | 0.991 |
|   | 0.991 |
|   | 0.991 |
|   | 0.991 |
|   | 0.991 |
|   | 0.991 |
|   | 0.991 |
|   | 0.991 |
|   | 0.991 |
|   | 0.991 |
|   | 0.991 |
|   | 0.991 |
|   | 0.991 |
|   | 0.991 |
|   | 0.991 |
|   | 0.991 |
|   | 0.991 |
|   | 0.991 |
|   | 0.991 |
|   | 0.992 |
|   | 0.992 |
|   | 0.992 |
|   | 0.992 |
|   | 0.992 |
|   | 0.992 |
|   | 0.992 |
|   | 0.992 |
|   | 0.992 |
|   | 0.992 |
|   | 0.992 |
|   | 0.992 |
|   | 0.992 |
|   | 0.992 |
|   | 0.992 |
|   | 0.992 |
|   | 0.992 |
|   | 0.992 |
|   | 0.992 |
|   | 0.992 |
|   | 0.992 |
|   | 0.992 |
|   | 0.992 |
|   | 0.992 |
|   | 0.992 |
|   | 0.992 |
|   | 0.992 |
|   | 0.992 |
|   | 0.992 |
|   | 0.992 |
|   | 0.992 |
|   | 0.992 |
|   | 0.992 |
|   | 0.992 |
|   | 0.992 |
|   | 0.992 |
|   | 0.992 |
|   | 0.992 |
|   | 0.992 |
|   | 0.992 |
|   | 0.992 |
|   | 0.992 |
|   | 0.992 |
|   | 0.992 |
|   | 0.992 |
|   | 0.992 |
|   | 0.992 |
|   | 0.992 |
|   | 0.992 |
|   | 0.992 |
|   | 0.992 |
|   | 0.992 |
|   | 0.992 |
|   | 0.992 |
|   | 0.993 |
|   | 0.993 |
|   | 0.993 |
|   | 0.993 |
|   | 0.993 |
|   | 0.993 |
|   | 0.993 |
|   | 0.993 |
|   | 0.993 |
|   | 0.993 |
|   | 0.993 |
|   | 0.993 |
|   | 0.993 |
|   | 0.993 |
|   | 0.993 |
|   | 0.993 |
|   | 0.993 |
|   | 0.993 |
|   | 0.993 |
|   | 0.993 |
|   | 0.993 |
|   | 0.993 |
|   | 0.993 |
|   | 0.993 |
|   | 0.993 |
|   | 0.993 |
|   | 0.993 |
|   | 0.993 |
|   | 0.993 |
|   | 0.993 |
|   | 0.993 |
|   | 0.993 |
|   | 0.993 |
|   | 0.993 |
|   | 0.993 |
|   | 0.993 |
|   | 0.993 |
|   | 0.993 |
|   | 0.993 |
|   | 0.993 |
|   | 0.993 |
|   | 0.993 |
|   | 0.993 |
|   | 0.993 |
|   | 0.993 |
|   | 0.993 |
|   | 0.993 |
|   | 0.993 |
|   | 0.993 |
|   | 0.993 |
|   | 0.993 |
|   | 0.993 |
|   | 0.993 |
|   | 0.993 |
|   | 0.993 |
|   | 0.993 |
|   | 0.993 |
|   | 0.993 |
|   | 0.993 |
|   | 0.993 |
|   | 0.994 |
|   | 0.994 |
|   | 0.994 |
|   | 0.994 |
|   | 0.994 |
|   | 0.994 |
|   | 0.994 |
|   | 0.994 |
|   | 0.994 |
|   | 0.994 |
|   | 0.994 |
|   | 0.994 |
|   | 0.994 |
|   | 0.994 |
|   | 0.994 |
|   | 0.994 |
|   | 0.994 |
|   | 0.994 |
|   | 0.994 |
|   | 0.994 |
|   | 0.994 |
|   | 0.994 |
|   | 0.994 |
|   | 0.994 |
|   | 0.994 |
|   | 0.994 |
|   | 0.994 |
|   | 0.994 |
|   | 0.994 |
|   | 0.994 |
|   | 0.994 |
|   | 0.994 |
|   | 0.994 |
|   | 0.994 |
|   | 0.994 |
|   | 0.994 |
|   | 0.994 |
|   | 0.994 |
|   | 0.994 |
|   | 0.994 |
|   | 0.994 |
|   | 0.994 |
|   | 0.994 |
|   | 0.994 |
|   | 0.994 |
|   | 0.994 |
|   | 0.994 |
|   | 0.994 |
|   | 0.994 |
|   | 0.994 |
|   | 0.994 |
|   | 0.994 |
|   | 0.994 |
|   | 0.994 |
|   | 0.994 |
|   | 0.994 |
|   | 0.994 |
|   | 0.994 |
|   | 0.994 |
|   | 0.994 |
|   | 0.994 |
|   | 0.994 |
|   | 0.994 |
|   | 0.994 |
|   | 0.994 |
|   | 0.994 |
|   | 0.994 |
|   | 0.994 |
|   | 0.995 |
|   | 0.995 |
|   | 0.995 |
|   | 0.995 |
|   | 0.995 |
|   | 0.995 |
|   | 0.995 |
|   | 0.995 |
|   | 0.995 |
|   | 0.995 |
|   | 0.995 |
|   | 0.995 |
|   | 0.995 |
|   | 0.995 |
|   | 0.995 |
|   | 0.995 |
|   | 0.995 |
|   | 0.995 |
|   | 0.995 |
|   | 0.995 |
|   | 0.995 |
|   | 0.995 |
|   | 0.995 |
|   | 0.995 |
|   | 0.995 |
|   | 0.995 |
|   | 0.995 |
|   | 0.995 |
|   | 0.995 |
|   | 0.995 |
|   | 0.995 |
|   | 0.995 |
|   | 0.995 |
|   | 0.995 |
|   | 0.995 |
|   | 0.995 |
|   | 0.995 |
|   | 0.995 |
|   | 0.995 |
|   | 0.995 |
|   | 0.995 |
|   | 0.995 |
|   | 0.995 |
|   | 0.995 |
|   | 0.995 |
|   | 0.995 |
|   | 0.995 |
|   | 0.995 |
|   | 0.995 |
|   | 0.995 |
|   | 0.995 |
|   | 0.995 |
|   | 0.995 |
|   | 0.995 |
|   | 0.995 |
|   | 0.995 |
|   | 0.995 |
|   | 0.995 |
|   | 0.995 |
|   | 0.995 |
|   | 0.995 |
|   | 0.995 |
|   | 0.995 |
|   | 0.995 |
|   | 0.995 |
|   | 0.995 |
|   | 0.995 |
|   | 0.995 |
|   | 0.995 |
|   | 0.995 |
|   | 0.995 |
|   | 0.995 |
|   | 0.995 |
|   | 0.995 |
|   | 0.995 |
|   | 0.995 |
|   | 0.996 |
|   | 0.996 |
|   | 0.996 |
|   | 0.996 |
|   | 0.996 |
|   | 0.996 |
|   | 0.996 |
|   | 0.996 |
|   | 0.996 |
|   | 0.996 |
|   | 0.996 |
|   | 0.996 |
|   | 0.996 |
|   | 0.996 |
|   | 0.996 |
|   | 0.996 |
|   | 0.996 |
|   | 0.996 |
|   | 0.996 |
|   | 0.996 |
|   | 0.996 |
|   | 0.996 |
|   | 0.996 |
|   | 0.996 |
|   | 0.996 |
|   | 0.996 |
|   | 0.996 |
|   | 0.996 |
|   | 0.996 |
|   | 0.996 |
|   | 0.996 |
|   | 0.996 |
|   | 0.996 |
|   | 0.996 |
|   | 0.996 |
|   | 0.996 |
|   | 0.996 |
|   | 0.996 |
|   | 0.996 |
|   | 0.996 |
|   | 0.996 |
|   | 0.996 |
|   | 0.996 |
|   | 0.996 |
|   | 0.996 |
|   | 0.996 |
|   | 0.996 |
|   | 0.996 |
|   | 0.996 |
|   | 0.996 |
|   | 0.996 |
|   | 0.996 |
|   | 0.996 |
|   | 0.996 |
|   | 0.996 |
|   | 0.996 |
|   | 0.996 |
|   | 0.996 |
|   | 0.996 |
|   | 0.996 |
|   | 0.996 |
|   | 0.996 |
|   | 0.996 |
|   | 0.996 |
|   | 0.996 |
|   | 0.996 |
|   | 0.996 |
|   | 0.996 |
|   | 0.996 |
|   | 0.996 |
|   | 0.996 |
|   | 0.996 |
|   | 0.996 |
|   | 0.996 |
|   | 0.996 |
|   | 0.996 |
|   | 0.996 |
|   | 0.996 |
|   | 0.996 |
|   | 0.996 |
|   | 0.996 |
|   | 0.996 |
|   | 0.996 |
|   | 0.996 |
|   | 0.996 |
|   | 0.996 |
|   | 0.997 |
|   | 0.997 |
|   | 0.997 |
|   | 0.997 |
|   | 0.997 |
|   | 0.997 |
|   | 0.997 |
|   | 0.997 |
|   | 0.997 |
|   | 0.997 |
|   | 0.997 |
|   | 0.997 |
|   | 0.997 |
|   | 0.997 |
|   | 0.997 |
|   | 0.997 |
|   | 0.997 |
|   | 0.997 |
|   | 0.997 |
|   | 0.997 |
|   | 0.997 |
|   | 0.997 |
|   | 0.997 |
|   | 0.997 |
|   | 0.997 |
|   | 0.997 |
|   | 0.997 |
|   | 0.997 |
|   | 0.997 |
|   | 0.997 |
|   | 0.997 |
|   | 0.997 |
|   | 0.997 |
|   | 0.997 |
|   | 0.997 |
|   | 0.997 |
|   | 0.997 |
|   | 0.997 |
|   | 0.997 |
|   | 0.997 |
|   | 0.997 |
|   | 0.997 |
|   | 0.997 |
|   | 0.997 |
|   | 0.997 |
|   | 0.997 |
|   | 0.997 |
|   | 0.997 |
|   | 0.997 |
|   | 0.997 |
|   | 0.997 |
|   | 0.997 |
|   | 0.997 |
|   | 0.997 |
|   | 0.997 |
|   | 0.997 |
|   | 0.997 |
|   | 0.997 |
|   | 0.997 |
|   | 0.997 |
|   | 0.997 |
|   | 0.997 |
|   | 0.997 |
|   | 0.997 |
|   | 0.997 |
|   | 0.997 |
|   | 0.997 |
|   | 0.997 |
|   | 0.997 |
|   | 0.997 |
|   | 0.997 |
|   | 0.997 |
|   | 0.997 |
|   | 0.997 |
|   | 0.997 |
|   | 0.997 |
|   | 0.997 |
|   | 0.997 |
|   | 0.997 |
|   | 0.997 |
|   | 0.997 |
|   | 0.997 |
|   | 0.997 |
|   | 0.997 |
|   | 0.997 |
|   | 0.997 |
|   | 0.997 |
|   | 0.997 |
|   | 0.997 |
|   | 0.997 |
|   | 0.997 |
|   | 0.997 |
|   | 0.997 |
|   | 0.997 |
|   | 0.997 |
|   | 0.997 |
|   | 0.997 |
|   | 0.997 |
|   | 0.997 |
|   | 0.997 |
|   | 0.997 |
|   | 0.997 |
|   | 0.997 |
|   | 0.998 |
|   | 0.998 |
|   | 0.998 |
|   | 0.998 |
|   | 0.998 |
|   | 0.998 |
|   | 0.998 |
|   | 0.998 |
|   | 0.998 |
|   | 0.998 |
|   | 0.998 |
|   | 0.998 |
|   | 0.998 |
|   | 0.998 |
|   | 0.998 |
|   | 0.998 |
|   | 0.998 |
|   | 0.998 |
|   | 0.998 |
|   | 0.998 |
|   | 0.998 |
|   | 0.998 |
|   | 0.998 |
|   | 0.998 |
|   | 0.998 |
|   | 0.998 |
|   | 0.998 |
|   | 0.998 |
|   | 0.998 |
|   | 0.998 |
|   | 0.998 |
|   | 0.998 |
|   | 0.998 |
|   | 0.998 |
|   | 0.998 |
|   | 0.998 |
|   | 0.998 |
|   | 0.998 |
|   | 0.998 |
|   | 0.998 |
|   | 0.998 |
|   | 0.998 |
|   | 0.998 |
|   | 0.998 |
|   | 0.998 |
|   | 0.998 |
|   | 0.998 |
|   | 0.998 |
|   | 0.998 |
|   | 0.998 |
|   | 0.998 |
|   | 0.998 |
|   | 0.998 |
|   | 0.998 |
|   | 0.998 |
|   | 0.998 |
|   | 0.998 |
|   | 0.998 |
|   | 0.998 |
|   | 0.998 |
|   | 0.998 |
|   | 0.998 |
|   | 0.998 |
|   | 0.998 |
|   | 0.998 |
|   | 0.998 |
|   | 0.998 |
|   | 0.998 |
|   | 0.998 |
|   | 0.998 |
|   | 0.998 |
|   | 0.998 |
|   | 0.998 |
|   | 0.998 |
|   | 0.998 |
|   | 0.998 |
|   | 0.998 |
|   | 0.998 |
|   | 0.998 |
|   | 0.998 |
|   | 0.998 |
|   | 0.998 |
|   | 0.998 |
|   | 0.998 |
|   | 0.998 |
|   | 0.998 |
|   | 0.998 |
|   | 0.998 |
|   | 0.998 |
|   | 0.998 |
|   | 0.998 |
|   | 0.998 |
|   | 0.998 |
|   | 0.998 |
|   | 0.998 |
|   | 0.998 |
|   | 0.998 |
|   | 0.998 |
|   | 0.998 |
|   | 0.998 |
| 3000 | 0.998 |
|   | 0.998 |
|   | 0.998 |
|   | 0.998 |
|   | 0.998 |
|   | 0.998 |
|   | 0.998 |
|   | 0.998 |
|   | 0.998 |
|   | 0.998 |
|   | 0.998 |
|   | 0.998 |
|   | 0.998 |
|   | 0.998 |
|   | 0.998 |
|   | 0.998 |
|   | 0.998 |
|   | 0.998 |
|   | 0.998 |
|   | 0.998 |
|   | 0.998 |
|   | 0.998 |
|   | 0.998 |
|   | 0.998 |
|   | 0.998 |
|   | 0.998 |
|   | 0.998 |
|   | 0.998 |
|   | 0.998 |
|   | 0.998 |
|   | 0.998 |
|   | 0.998 |
|   | 0.998 |
|   | 0.998 |
|   | 0.998 |
|   | 0.998 |
|   | 0.998 |
|   | 0.999 |
|   | 0.999 |
|   | 0.999 |
|   | 0.999 |
|   | 0.999 |
|   | 0.999 |
|   | 0.999 |
|   | 0.999 |
|   | 0.999 |
|   | 0.999 |
|   | 0.999 |
|   | 0.999 |
|   | 0.999 |
|   | 0.999 |
|   | 0.999 |
|   | 0.999 |
|   | 0.999 |
|   | 0.999 |
|   | 0.999 |
|   | 0.999 |
|   | 0.999 |
|   | 0.999 |
|   | 0.999 |
|   | 0.999 |
|   | 0.999 |
|   | 0.999 |
|   | 0.999 |
|   | 0.999 |
|   | 0.999 |
|   | 0.999 |
|   | 0.999 |
|   | 0.999 |
|   | 0.999 |
|   | 0.999 |
|   | 0.999 |
|   | 0.999 |
|   | 0.999 |
|   | 0.999 |
|   | 0.999 |
|   | 0.999 |
|   | 0.999 |
|   | 0.999 |
|   | 0.999 |
|   | 0.999 |
|   | 0.999 |
|   | 0.999 |
|   | 0.999 |
|   | 0.999 |
|   | 0.999 |
|   | 0.999 |
|   | 0.999 |
|   | 0.999 |
|   | 0.999 |
|   | 0.999 |
|   | 0.999 |
|   | 0.999 |
|   | 0.999 |
|   | 0.999 |
|   | 0.999 |
|   | 0.999 |
|   | 0.999 |
|   | 0.999 |
|   | 0.999 |
|   | 0.999 |
|   | 0.999 |
|   | 0.999 |
|   | 0.999 |
|   | 0.999 |
|   | 0.999 |
|   | 0.999 |
|   | 0.999 |
|   | 0.999 |
|   | 0.999 |
|   | 0.999 |
|   | 0.999 |
|   | 0.999 |
|   | 0.999 |
|   | 0.999 |
|   | 0.999 |
|   | 0.999 |
|   | 0.999 |
|   | 0.999 |
|   | 0.999 |
|   | 0.999 |
|   | 0.999 |
|   | 0.999 |
|   | 0.999 |
|   | 0.999 |
|   | 0.999 |
|   | 0.999 |
|   | 0.999 |
|   | 0.999 |
|   | 0.999 |
|   | 0.999 |
|   | 0.999 |
|   | 0.999 |
|   | 0.999 |
|   | 0.999 |
|   | 0.999 |
|   | 0.999 |
|   | 0.999 |
|   | 0.999 |
|   | 0.999 |
|   | 0.999 |
|   | 0.999 |
|   | 0.999 |
|   | 0.999 |
|   | 0.999 |
|   | 0.999 |
|   | 0.999 |
|   | 0.999 |
|   | 0.999 |
|   | 0.999 |
|   | 0.999 |
|   | 0.999 |
|   | 0.999 |
|   | 0.999 |
|   | 0.999 |
|   | 0.999 |
|   | 0.999 |
|   | 0.999 |
|   | 0.999 |
|   | 0.999 |
|   | 0.999 |
|   | 0.999 |
|   | 0.999 |
|   | 0.999 |
|   | 0.999 |
|   | 0.999 |
|   | 0.999 |
|   | 0.999 |
|   | 0.999 |
|   | 0.999 |
|   | 0.999 |
|   | 0.999 |
|   | 0.999 |
|   | 0.999 |
|   | 0.999 |
|   | 0.999 |
|   | 0.999 |
|   | 0.999 |
|   | 0.999 |
|   | 0.999 |
|   | 0.999 |
|   | 0.999 |
|   | 0.999 |
|   | 0.999 |
|   | 0.999 |
|   | 0.999 |
|   | 0.999 |
|   | 0.999 |
|   | 0.999 |
|   | 0.999 |
|   | 0.999 |
|   | 0.999 |
|   | 0.999 |
|   | 0.999 |
|   | 0.999 |
|   | 0.999 |
|   | 0.999 |
|   | 0.999 |
|   | 0.999 |
|   | 0.999 |
|   | 0.999 |
|   | 0.999 |
|   | 0.999 |
|   | 0.999 |
|   | 0.999 |
|   | 0.999 |
|   | 0.999 |
|   | 0.999 |
|   | 0.999 |
|   | 0.999 |
|   | 0.999 |
|   | 0.999 |
|   | 0.999 |
|   | 0.999 |
|   | 0.999 |
|   | 0.999 |
|   | 0.999 |
|   | 0.999 |
|   | 0.999 |
|   | 0.999 |
|   | 0.999 |
|   | 0.999 |
|   | 0.999 |
|   | 0.999 |
|   | 0.999 |
|   | 0.999 |
|   | 0.999 |
|   | 0.999 |
|   | 0.999 |
|   | 0.999 |
|   | 0.999 |
|   | 0.999 |
|   | 0.999 |
|   | 0.999 |
|   | 0.999 |
|   | 0.999 |
|   | 0.999 |
|   | 0.999 |
|   | 0.999 |
|   | 0.999 |
|   | 0.999 |
|   | 0.999 |
|   | 0.999 |
|   | 0.999 |
|   | 0.999 |
|   | 0.999 |
|   | 0.999 |
|   | 0.999 |
|   | 0.999 |
|   | 0.999 |
|   | 0.999 |
|   | 0.999 |
|   | 0.999 |
|   | 0.999 |
|   | 0.999 |
|   | 0.999 |
|   | 0.999 |
|   | 0.999 |
|   | 0.999 |
|   | 1 |
|   | 1 |
|   | 1 |
|   | 1 |
|   | 1 |
|   | 1 |
|   | 1 |
|   | 1 |
|   | 1 |
|   | 1 |
|   | 1 |
|   | 1 |
|   | 1 |
|   | 1 |
|   | 1 |
|   | 1 |
|   | 1 |
|   | 1 |
|   | 1 |
|   | 1 |
|   | 1 |
|   | 1 |
|   | 1 |
|   | 1 |
|   | 1 |
|   | 1 |
|   | 1 |
|   | 1 |
|   | 1 |
|   | 1 |
|   | 1 |
|   | 1 |
|   | 1 |
|   | 1 |
|   | 1 |
|   | 1 |
|   | 1 |
|   | 1 |
|   | 1 |
|   | 1 |
|   | 1 |
|   | 1 |
|   | 1 |
|   | 1 |
|   | 1 |
|   | 1 |
|   | 1 |
|   | 1 |
|   | 1 |
|   | 1 |
|   | 1 |
|   | 1 |
|   | 1 |
|   | 1 |
|   | 1 |
|   | 1 |
|   | 1 |
|   | 1 |
|   | 1 |
|   | 1 |
|   | 1 |
|   | 1 |
|   | 1 |
|   | 1 |
|   | 1 |
|   | 1 |
|   | 1 |
|   | 1 |
|   | 1 |
|   | 1 |
|   | 1 |
|   | 1 |
|   | 1 |
|   | 1 |
|   | 1 |
|   | 1 |
|   | 1 |
|   | 1 |
|   | 1 |
|   | 1 |
|   | 1 |
|   | 1 |
|   | 1 |
|   | 1 |
|   | 1 |
|   | 1 |
|   | 1 |
|   | 1 |
|   | 1 |
|   | 1 |
|   | 1 |
|   | 1 |
|   | 1 |
|   | 1 |
|   | 1 |
|   | 1 |
|   | 1 |
|   | 1 |
|   | 1 |
|   | 1 |
|   | 1 |
|   | 1 |
|   | 1 |
|   | 1 |
|   | 1 |
|   | 1 |
|   | 1 |
|   | 1 |
|   | 1 |
|   | 1 |
|   | 1 |
|   | 1 |
|   | 1 |
|   | 1 |
|   | 1 |
|   | 1 |
|   | 1 |
|   | 1 |
|   | 1 |
|   | 1 |
|   | 1 |
|   | 1 |
|   | 1 |
|   | 1 |
|   | 1 |
|   | 1 |
|   | 1 |
|   | 1 |
|   | 1 |
|   | 1 |
|   | 1 |
|   | 1 |
|   | 1 |
|   | 1 |
|   | 1 |
|   | 1 |
|   | 1 |
|   | 1 |
|   | 1 |
|   | 1 |
|   | 1 |
|   | 1 |
|   | 1 |
|   | 1 |
|   | 1 |
|   | 1 |
|   | 1 |
|   | 1 |
|   | 1 |
|   | 1 |
|   | 1 |
|   | 1 |
|   | 1 |
|   | 1 |
|   | 1 |
|   | 1 |
|   | 1 |
|   | 1 |
|   | 1 |
|   | 1 |
|   | 1 |
|   | 1 |
|   | 1 |
|   | 1 |
|   | 1 |
|   | 1 |
|   | 1 |
|   | 1 |
|   | 1 |
|   | 1 |
|   | 1 |
|   | 1 |
|   | 1 |
|   | 1 |
|   | 1 |
|   | 1 |
|   | 1 |
|   | 1 |
|   | 1 |
|   | 1 |
|   | 1 |
|   | 1 |
|   | 1 |
|   | 1 |
|   | 1 |
|   | 1 |
|   | 1 |
|   | 1 |
|   | 1 |
|   | 1 |
|   | 1 |
|   | 1 |
|   | 1 |
|   | 1 |
|   | 1 |
|   | 1 |
|   | 1 |
|   | 1 |
|   | 1 |
|   | 1 |
|   | 1 |
|   | 1 |
|   | 1 |
|   | 1 |
|   | 1 |
|   | 1 |
|   | 1 |
|   | 1 |
|   | 1 |
|   | 1 |
|   | 1 |
|   | 1 |
|   | 1 |
|   | 1 |
|   | 1 |
|   | 1 |
|   | 1 |
|   | 1 |
|   | 1 |
|   | 1 |
|   | 1 |
|   | 1 |
|   | 1 |
|   | 1 |
|   | 1 |
|   | 1 |
|   | 1 |
|   | 1 |
|   | 1 |
|   | 1 |
|   | 1 |
|   | 1 |
|   | 1 |
|   | 1 |
|   | 1 |
|   | 1 |
|   | 1 |
|   | 1 |
|   | 1 |
|   | 1 |
|   | 1 |
|   | 1 |
|   | 1 |
|   | 1 |
|   | 1 |
|   | 1 |
|   | 1 |
|   | 1 |
|   | 1 |
|   | 1 |
|   | 1 |
|   | 1 |
|   | 1 |
|   | 1 |
|   | 1 |
|   | 1 |
|   | 1 |
|   | 1 |
|   | 1 |
|   | 1 |
|   | 1 |
|   | 1 |
|   | 1 |
|   | 1 |
|   | 1 |
|   | 1 |
|   | 1 |
|   | 1 |
|   | 1 |
|   | 1 |
|   | 1 |
|   | 1 |
|   | 1 |
|   | 1 |
|   | 1 |
|   | 1 |
|   | 1 |
|   | 1 |
|   | 1 |
|   | 1 |
|   | 1 |
|   | 1 |
|   | 1 |
|   | 1 |
|   | 1 |
|   | 1 |
|   | 1 |
|   | 1 |
|   | 1 |
|   | 1 |
|   | 1 |
|   | 1 |
|   | 1 |
|   | 1 |
|   | 1 |
|   | 1 |
|   | 1 |
|   | 1 |
|   | 1 |
|   | 1 |
|   | 1 |
|   | 1 |
|   | 1 |
|   | 1 |
|   | 1 |
|   | 1 |
|   | 1 |
|   | 1 |
|   | 1 |
|   | 1 |
|   | 1 |
|   | 1 |
|   | 1 |
|   | 1 |
|   | 1 |
|   | 1 |
|   | 1 |
|   | 1 |
|   | 1 |
|   | 1 |
|   | 1 |
|   | 1 |
|   | 1 |
|   | 1 |
|   | 1 |
|   | 1 |
|   | 1 |
|   | 1 |
|   | 1 |
|   | 1 |
|   | 1 |
|   | 1 |
|   | 1 |
|   | 1 |
|   | 1 |
|   | 1 |
|   | 1 |
|   | 1 |
|   | 1 |
|   | 1 |
|   | 1 |
|   | 1 |
|   | 1 |
|   | 1 |
|   | 1 |
|   | 1 |
|   | 1 |
|   | 1 |
|   | 1 |
|   | 1 |
|   | 1 |
|   | 1 |
|   | 1 |
|   | 1 |
|   | 1 |
|   | 1 |
|   | 1 |
|   | 1 |
|   | 1 |
|   | 1 |
|   | 1 |
|   | 1 |
|   | 1 |
|   | 1 |
|   | 1 |
|   | 1 |
|   | 1 |
|   | 1 |
|   | 1 |
|   | 1 |
|   | 1 |
|   | 1 |
|   | 1 |
|   | 1 |
|   | 1 |
|   | 1 |
|   | 1 |
|   | 1 |
|   | 1 |
|   | 1 |
|   | 1 |
|   | 1 |
|   | 1 |
|   | 1 |
|   | 1 |
|   | 1 |
|   | 1 |
|   | 1 |
|   | 1 |
|   | 1 |
|   | 1 |
|   | 1 |
|   | 1 |
|   | 1 |
|   | 1 |
|   | 1 |
|   | 1 |
|   | 1 |
|   | 1 |
|   | 1 |
|   | 1 |
|   | 1 |
|   | 1 |
|   | 1 |
|   | 1 |
|   | 1 |
|   | 1 |
|   | 1 |
|   | 1 |
|   | 1 |
|   | 1 |
|   | 1 |
|   | 1 |
|   | 1 |
|   | 1 |
|   | 1 |
|   | 1 |
|   | 1 |
|   | 1 |
|   | 1 |
|   | 1 |
|   | 1 |
|   | 1 |
|   | 1 |
|   | 1 |
|   | 1 |
|   | 1 |
|   | 1 |
|   | 1 |
|   | 1 |
|   | 1 |
|   | 1 |
|   | 1 |
|   | 1 |
|   | 1 |
|   | 1 |
|   | 1 |
|   | 1 |
|   | 1 |
|   | 1 |
|   | 1 |
|   | 1 |
|   | 1 |
|   | 1 |
|   | 1 |
|   | 1 |
|   | 1 |
|   | 1 |
|   | 1 |
|   | 1 |
|   | 1 |
|   | 1 |
|   | 1 |
|   | 1 |
|   | 1 |
|   | 1 |
|   | 1 |
|   | 1 |
|   | 1 |
|   | 1 |
|   | 1 |
|   | 1 |
|   | 1 |
|   | 1 |
|   | 1 |
|   | 1 |
|   | 1 |
|   | 1 |
|   | 1 |
|   | 1 |
|   | 1 |
|   | 1 |
|   | 1 |
|   | 1 |
|   | 1 |
|   | 1 |
|   | 1 |
|   | 1 |
|   | 1 |
|   | 1 |
|   | 1 |
|   | 1 |
|   | 1 |
|   | 1 |
|   | 1 |
|   | 1 |
|   | 1 |
|   | 1 |
|   | 1 |
|   | 1 |
|   | 1 |
|   | 1 |
|   | 1 |
|   | 1 |
|   | 1 |
|   | 1 |
|   | 1 |
|   | 1 |
|   | 1 |
|   | 1 |
|   | 1 |
|   | 1 |
|   | 1 |
|   | 1 |
|   | 1 |
|   | 1 |
|   | 1 |
|   | 1 |
|   | 1 |
|   | 1 |
|   | 1 |
|   | 1 |
|   | 1 |
|   | 1 |
|   | 1 |
|   | 1 |
|   | 1 |
|   | 1 |
|   | 1 |
|   | 1 |
|   | 1 |
|   | 1 |
|   | 1 |
|   | 1 |
|   | 1 |
|   | 1 |
|   | 1 |
|   | 1 |
|   | 1 |
|   | 1 |
|   | 1 |
|   | 1 |
|   | 1 |
|   | 1 |
|   | 1 |
|   | 1 |
|   | 1 |
|   | 1 |
|   | 1 |
|   | 1 |
|   | 1 |
|   | 1 |
|   | 1 |
|   | 1 |
|   | 1 |
|   | 1 |
|   | 1 |
|   | 1 |
|   | 1 |
|   | 1 |
|   | 1 |
|   | 1 |
|   | 1 |
|   | 1 |
|   | 1 |
|   | 1 |
|   | 1 |
|   | 1 |
|   | 1 |
|   | 1 |
|   | 1 |
|   | 1 |
|   | 1 |
|   | 1 |
|   | 1 |
|   | 1 |
|   | 1 |
|   | 1 |
|   | 1 |
|   | 1 |
|   | 1 |
|   | 1 |
|   | 1 |
|   | 1 |
|   | 1 |
|   | 1 |
|   | 1 |
|   | 1 |
|   | 1 |
|   | 1 |
|   | 1 |
|   | 1 |
|   | 1 |
|   | 1 |
|   | 1 |
|   | 1 |
|   | 1 |
|   | 1 |
|   | 1 |
|   | 1 |
|   | 1 |
|   | 1 |
|   | 1 |
|   | 1 |
|   | 1 |
|   | 1 |
|   | 1 |
|   | 1 |
|   | 1 |
|   | 1 |
|   | 1 |
|   | 1 |
|   | 1 |
|   | 1 |
|   | 1 |
|   | 1 |
|   | 1 |
|   | 1 |
|   | 1 |
|   | 1 |
|   | 1 |
|   | 1 |
|   | 1 |
|   | 1 |
|   | 1 |
|   | 1 |
|   | 1 |
|   | 1 |
|   | 1 |
|   | 1 |
|   | 1 |
|   | 1 |
|   | 1 |
|   | 1 |
|   | 1 |
|   | 1 |
|   | 1 |
|   | 1 |
|   | 1 |
|   | 1 |
|   | 1 |
|   | 1 |
|   | 1 |
|   | 1 |
|   | 1 |
|   | 1 |
|   | 1 |
|   | 1 |
|   | 1 |
|   | 1 |
|   | 1 |
|   | 1 |
|   | 1 |
|   | 1 |
|   | 1 |
|   | 1 |
|   | 1 |
|   | 1 |
|   | 1 |
|   | 1 |
|   | 1 |
|   | 1 |
|   | 1 |
|   | 1 |
|   | 1 |
|   | 1 |
|   | 1 |
|   | 1 |
|   | 1 |
|   | 1 |
|   | 1 |
|   | 1 |
|   | 1 |
|   | 1 |
|   | 1 |
|   | 1 |
|   | 1 |
|   | 1 |
|   | 1 |
|   | 1 |
|   | 1 |
|   | 1 |
|   | 1 |
|   | 1 |
|   | 1 |
|   | 1 |
|   | 1 |
|   | 1 |
|   | 1 |
|   | 1 |
|   | 1 |
|   | 1 |
|   | 1 |
|   | 1 |
|   | 1 |
|   | 1 |
|   | 1 |
|   | 1 |
|   | 1 |
|   | 1 |
|   | 1 |
|   | 1 |
|   | 1 |
|   | 1 |
|   | 1 |
|   | 1 |
|   | 1 |
|   | 1 |
|   | 1 |
|   | 1 |
|   | 1 |
|   | 1 |
|   | 1 |
|   | 1 |
|   | 1 |
|   | 1 |
|   | 1 |
|   | 1 |
|   | 1 |
|   | 1 |
|   | 1 |
|   | 1 |
|   | 1 |
|   | 1 |
|   | 1 |
|   | 1 |
|   | 1 |
|   | 1 |
|   | 1 |
|   | 1 |
|   | 1 |
|   | 1 |
|   | 1 |
|   | 1 |
|   | 1 |
|   | 1 |
|   | 1 |
|   | 1 |
|   | 1 |
|   | 1 |
|   | 1 |
|   | 1 |
|   | 1 |
|   | 1 |
|   | 1 |
|   | 1 |
|   | 1 |
|   | 1 |
|   | 1 |
|   | 1 |
|   | 1 |
| 4000 | 1 |
|   | 1 |
|   | 1 |
|   | 1 |
|   | 1 |
|   | 1 |
|   | 1 |
|   | 1 |
|   | 1 |
|   | 1 |
|   | 1 |
|   | 1 |
|   | 1 |
|   | 1 |
|   | 1 |
|   | 1 |
|   | 1 |
|   | 1 |
|   | 1 |
|   | 1 |
|   | 1 |
|   | 1 |
|   | 1 |
|   | 1 |
|   | 1 |
|   | 1 |
|   | 1 |
|   | 1 |
|   | 1 |
|   | 1 |
|   | 1 |
|   | 1 |
|   | 1 |
|   | 1 |
|   | 1 |
|   | 1 |
|   | 1 |
|   | 1 |
|   | 1 |
|   | 1 |
|   | 1 |
|   | 1 |
|   | 1 |
|   | 1 |
|   | 1 |
|   | 1 |
|   | 1 |
|   | 1 |
|   | 1 |
|   | 1 |
|   | 1 |
|   | 1 |
|   | 1 |
|   | 1 |
|   | 1 |
|   | 1 |
|   | 1 |
|   | 1 |
|   | 1 |
|   | 1 |
|   | 1 |
|   | 1 |
|   | 1 |
|   | 1 |
|   | 1 |
|   | 1 |
|   | 1 |
|   | 1 |
|   | 1 |
|   | 1 |
|   | 1 |
|   | 1 |
|   | 1 |
|   | 1 |
|   | 1 |
|   | 1 |
|   | 1 |
|   | 1 |
|   | 1 |
|   | 1 |
|   | 1 |
|   | 1 |
|   | 1 |
|   | 1 |
|   | 1 |
|   | 1 |
|   | 1 |
|   | 1 |
|   | 1 |
|   | 1 |
|   | 1 |
|   | 1 |
|   | 1 |
|   | 1 |
|   | 1 |
|   | 1 |
|   | 1 |
|   | 1 |
|   | 1 |
|   | 1 |
|   | 1 |
|   | 1 |
|   | 1 |
|   | 1 |
|   | 1 |
|   | 1 |
|   | 1 |
|   | 1 |
|   | 1 |
|   | 1 |
|   | 1 |
|   | 1 |
|   | 1 |
|   | 1 |
|   | 1 |
|   | 1 |
|   | 1 |
|   | 1 |
|   | 1 |
|   | 1 |
|   | 1 |
|   | 1 |
|   | 1 |
|   | 1 |
|   | 1 |
|   | 1 |
|   | 1 |
|   | 1 |
|   | 1 |
|   | 1 |
|   | 1 |
|   | 1 |
|   | 1 |
|   | 1 |
|   | 1 |
|   | 1 |
|   | 1 |
|   | 1 |
|   | 1 |
|   | 1 |
|   | 1 |
|   | 1 |
|   | 1 |
|   | 1 |
|   | 1 |
|   | 1 |
|   | 1 |
|   | 1 |
|   | 1 |
|   | 1 |
|   | 1 |
|   | 1 |
|   | 1 |
|   | 1 |
|   | 1 |
|   | 1 |
|   | 1 |
|   | 1 |
|   | 1 |
|   | 1 |
|   | 1 |
|   | 1 |
|   | 1 |
|   | 1 |
|   | 1 |
|   | 1 |
|   | 1 |
|   | 1 |
|   | 1 |
|   | 1 |
|   | 1 |
|   | 1 |
|   | 1 |
|   | 1 |
|   | 1 |
|   | 1 |
|   | 1 |
|   | 1 |
|   | 1 |
|   | 1 |
|   | 1 |
|   | 1 |
|   | 1 |
|   | 1 |
|   | 1 |
|   | 1 |
|   | 1 |
|   | 1 |
|   | 1 |
|   | 1 |
|   | 1 |
|   | 1 |
|   | 1 |
|   | 1 |
|   | 1 |
|   | 1 |
|   | 1 |
|   | 1 |
|   | 1 |
|   | 1 |
|   | 1 |
|   | 1 |
|   | 1 |
|   | 1 |
|   | 1 |
|   | 1 |
|   | 1 |
|   | 1 |
|   | 1 |
|   | 1 |
|   | 1 |
|   | 1 |
|   | 1 |
|   | 1 |
|   | 1 |
|   | 1 |
|   | 1 |